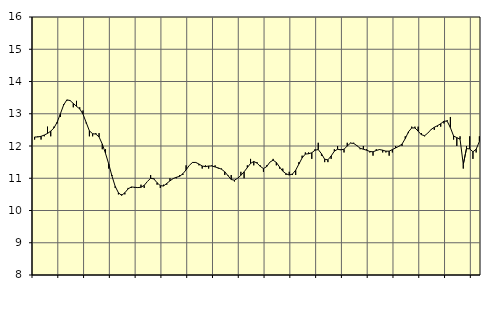
| Category | Piggar | Handel, SNI 45-471 |
|---|---|---|
| nan | 12.2 | 12.28 |
| 87.0 | 12.3 | 12.28 |
| 87.0 | 12.2 | 12.3 |
| 87.0 | 12.3 | 12.34 |
| nan | 12.6 | 12.39 |
| 88.0 | 12.3 | 12.46 |
| 88.0 | 12.6 | 12.56 |
| 88.0 | 12.7 | 12.74 |
| nan | 12.9 | 13 |
| 89.0 | 13.3 | 13.27 |
| 89.0 | 13.4 | 13.43 |
| 89.0 | 13.4 | 13.41 |
| nan | 13.2 | 13.32 |
| 90.0 | 13.4 | 13.23 |
| 90.0 | 13.2 | 13.15 |
| 90.0 | 13.1 | 12.99 |
| nan | 12.7 | 12.73 |
| 91.0 | 12.3 | 12.47 |
| 91.0 | 12.3 | 12.38 |
| 91.0 | 12.4 | 12.37 |
| nan | 12.4 | 12.28 |
| 92.0 | 11.9 | 12.06 |
| 92.0 | 11.9 | 11.77 |
| 92.0 | 11.3 | 11.44 |
| nan | 11.1 | 11.07 |
| 93.0 | 10.7 | 10.75 |
| 93.0 | 10.5 | 10.55 |
| 93.0 | 10.5 | 10.47 |
| nan | 10.5 | 10.55 |
| 94.0 | 10.7 | 10.67 |
| 94.0 | 10.7 | 10.73 |
| 94.0 | 10.7 | 10.72 |
| nan | 10.7 | 10.71 |
| 95.0 | 10.8 | 10.72 |
| 95.0 | 10.7 | 10.78 |
| 95.0 | 10.9 | 10.9 |
| nan | 11.1 | 11 |
| 96.0 | 11 | 10.98 |
| 96.0 | 10.8 | 10.86 |
| 96.0 | 10.7 | 10.77 |
| nan | 10.8 | 10.76 |
| 97.0 | 10.8 | 10.84 |
| 97.0 | 11 | 10.92 |
| 97.0 | 11 | 10.99 |
| nan | 11 | 11.03 |
| 98.0 | 11.1 | 11.06 |
| 98.0 | 11.1 | 11.14 |
| 98.0 | 11.4 | 11.26 |
| nan | 11.4 | 11.4 |
| 99.0 | 11.5 | 11.49 |
| 99.0 | 11.5 | 11.49 |
| 99.0 | 11.4 | 11.44 |
| nan | 11.3 | 11.38 |
| 0.0 | 11.4 | 11.36 |
| 0.0 | 11.3 | 11.38 |
| 0.0 | 11.4 | 11.38 |
| nan | 11.4 | 11.35 |
| 1.0 | 11.3 | 11.32 |
| 1.0 | 11.3 | 11.28 |
| 1.0 | 11.1 | 11.2 |
| nan | 11.1 | 11.08 |
| 2.0 | 11.1 | 10.96 |
| 2.0 | 10.9 | 10.94 |
| 2.0 | 11 | 11 |
| nan | 11.2 | 11.09 |
| 3.0 | 11 | 11.2 |
| 3.0 | 11.4 | 11.33 |
| 3.0 | 11.6 | 11.46 |
| nan | 11.4 | 11.52 |
| 4.0 | 11.5 | 11.47 |
| 4.0 | 11.4 | 11.37 |
| 4.0 | 11.2 | 11.3 |
| nan | 11.4 | 11.36 |
| 5.0 | 11.5 | 11.5 |
| 5.0 | 11.6 | 11.56 |
| 5.0 | 11.4 | 11.49 |
| nan | 11.3 | 11.35 |
| 6.0 | 11.3 | 11.22 |
| 6.0 | 11.1 | 11.14 |
| 6.0 | 11.2 | 11.1 |
| nan | 11.1 | 11.13 |
| 7.0 | 11.1 | 11.25 |
| 7.0 | 11.5 | 11.44 |
| 7.0 | 11.7 | 11.63 |
| nan | 11.8 | 11.75 |
| 8.0 | 11.8 | 11.76 |
| 8.0 | 11.6 | 11.79 |
| 8.0 | 11.9 | 11.87 |
| nan | 12.1 | 11.89 |
| 9.0 | 11.7 | 11.76 |
| 9.0 | 11.5 | 11.59 |
| 9.0 | 11.5 | 11.57 |
| nan | 11.6 | 11.69 |
| 10.0 | 11.9 | 11.84 |
| 10.0 | 12 | 11.9 |
| 10.0 | 11.9 | 11.88 |
| nan | 11.8 | 11.9 |
| 11.0 | 12.1 | 12 |
| 11.0 | 12.1 | 12.09 |
| 11.0 | 12.1 | 12.08 |
| nan | 12 | 12.01 |
| 12.0 | 11.9 | 11.93 |
| 12.0 | 12 | 11.9 |
| 12.0 | 11.9 | 11.87 |
| nan | 11.8 | 11.83 |
| 13.0 | 11.7 | 11.82 |
| 13.0 | 11.9 | 11.86 |
| 13.0 | 11.9 | 11.89 |
| nan | 11.8 | 11.87 |
| 14.0 | 11.8 | 11.84 |
| 14.0 | 11.7 | 11.84 |
| 14.0 | 11.8 | 11.89 |
| nan | 12 | 11.94 |
| 15.0 | 12 | 11.99 |
| 15.0 | 12 | 12.06 |
| 15.0 | 12.3 | 12.23 |
| nan | 12.4 | 12.44 |
| 16.0 | 12.6 | 12.56 |
| 16.0 | 12.6 | 12.56 |
| 16.0 | 12.6 | 12.46 |
| nan | 12.4 | 12.35 |
| 17.0 | 12.3 | 12.32 |
| 17.0 | 12.4 | 12.4 |
| 17.0 | 12.5 | 12.51 |
| nan | 12.5 | 12.58 |
| 18.0 | 12.6 | 12.63 |
| 18.0 | 12.6 | 12.69 |
| 18.0 | 12.7 | 12.77 |
| nan | 12.8 | 12.77 |
| 19.0 | 12.9 | 12.57 |
| 19.0 | 12.2 | 12.31 |
| 19.0 | 12 | 12.26 |
| nan | 12.3 | 12.21 |
| 20.0 | 11.3 | 11.43 |
| 20.0 | 12 | 11.92 |
| 20.0 | 12.3 | 11.91 |
| nan | 11.6 | 11.82 |
| 21.0 | 11.8 | 11.9 |
| 21.0 | 12.3 | 12.14 |